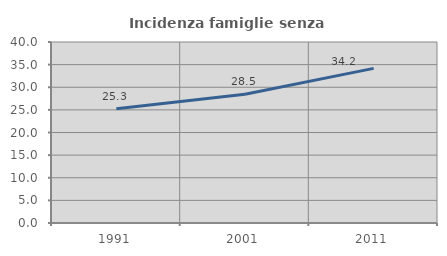
| Category | Incidenza famiglie senza nuclei |
|---|---|
| 1991.0 | 25.251 |
| 2001.0 | 28.47 |
| 2011.0 | 34.168 |